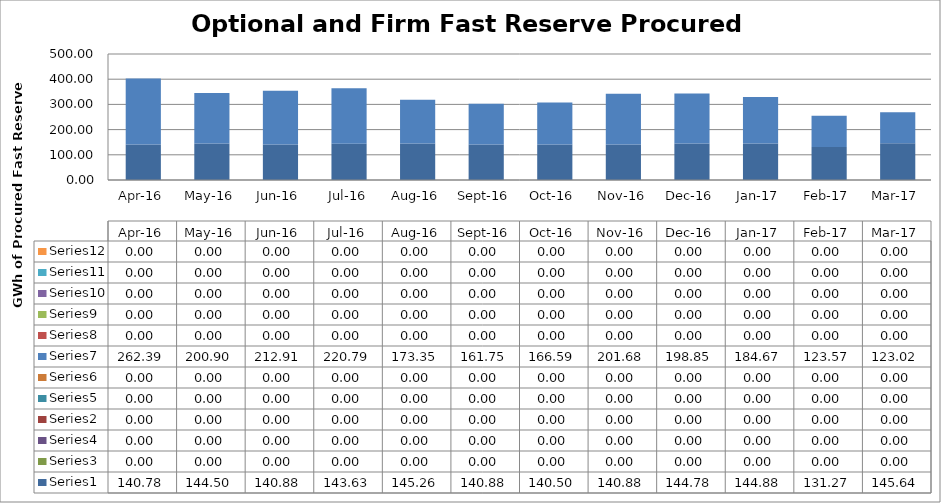
| Category | Series 0 | Series 2 | Series 3 | Series 1 | Series 4 | Series 5 | Series 6 | Series 7 | Series 8 | Series 9 | Series 10 | Series 11 |
|---|---|---|---|---|---|---|---|---|---|---|---|---|
| 2016-04-01 | 140.78 | 0 | 0 | 0 | 0 | 0 | 262.389 | 0 | 0 | 0 | 0 | 0 |
| 2016-05-01 | 144.5 | 0 | 0 | 0 | 0 | 0 | 200.9 | 0 | 0 | 0 | 0 | 0 |
| 2016-06-01 | 140.88 | 0 | 0 | 0 | 0 | 0 | 212.913 | 0 | 0 | 0 | 0 | 0 |
| 2016-07-01 | 143.63 | 0 | 0 | 0 | 0 | 0 | 220.79 | 0 | 0 | 0 | 0 | 0 |
| 2016-08-01 | 145.26 | 0 | 0 | 0 | 0 | 0 | 173.348 | 0 | 0 | 0 | 0 | 0 |
| 2016-09-01 | 140.88 | 0 | 0 | 0 | 0 | 0 | 161.749 | 0 | 0 | 0 | 0 | 0 |
| 2016-10-01 | 140.5 | 0 | 0 | 0 | 0 | 0 | 166.594 | 0 | 0 | 0 | 0 | 0 |
| 2016-11-01 | 140.88 | 0 | 0 | 0 | 0 | 0 | 201.684 | 0 | 0 | 0 | 0 | 0 |
| 2016-12-01 | 144.78 | 0 | 0 | 0 | 0 | 0 | 198.855 | 0 | 0 | 0 | 0 | 0 |
| 2017-01-01 | 144.88 | 0 | 0 | 0 | 0 | 0 | 184.667 | 0 | 0 | 0 | 0 | 0 |
| 2017-02-01 | 131.27 | 0 | 0 | 0 | 0 | 0 | 123.569 | 0 | 0 | 0 | 0 | 0 |
| 2017-03-01 | 145.64 | 0 | 0 | 0 | 0 | 0 | 123.018 | 0 | 0 | 0 | 0 | 0 |